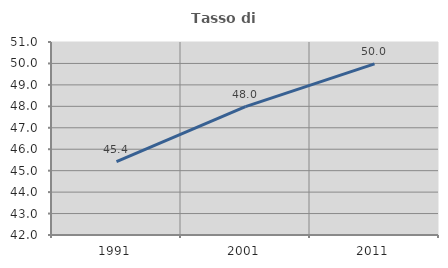
| Category | Tasso di occupazione   |
|---|---|
| 1991.0 | 45.42 |
| 2001.0 | 47.987 |
| 2011.0 | 49.981 |